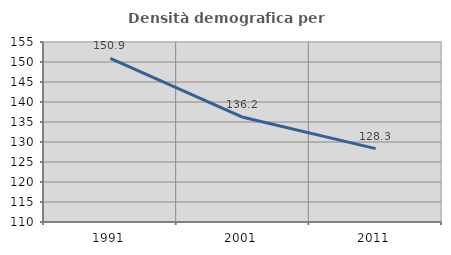
| Category | Densità demografica |
|---|---|
| 1991.0 | 150.93 |
| 2001.0 | 136.175 |
| 2011.0 | 128.343 |